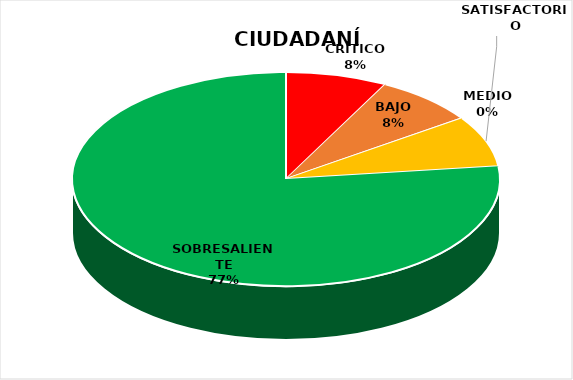
| Category | Series 0 |
|---|---|
| CRÍTICO | 1 |
| BAJO | 1 |
| MEDIO | 0 |
| SATISFACTORIO | 1 |
| SOBRESALIENTE | 10 |